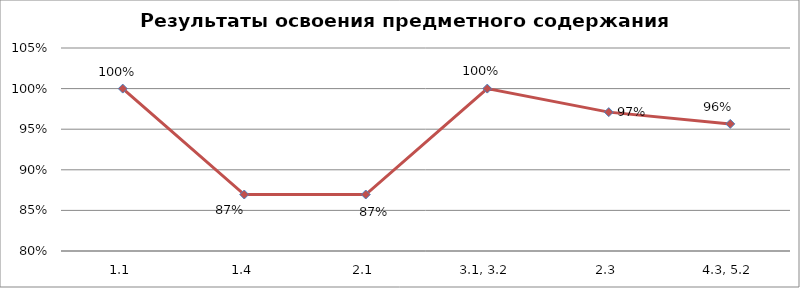
| Category | Series 0 |
|---|---|
| 1.1 | 1 |
| 1.4 | 0.87 |
| 2.1 | 0.87 |
| 3.1, 3.2 | 1 |
| 2.3 | 0.971 |
| 4.3, 5.2 | 0.957 |